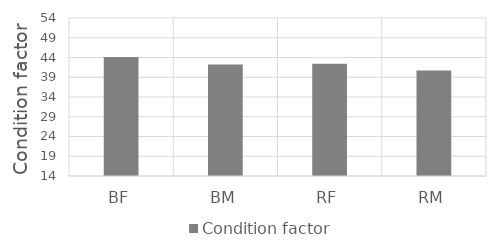
| Category | Condition factor |
|---|---|
| BF | 44.132 |
| BM | 42.218 |
| RF | 42.413 |
| RM | 40.733 |